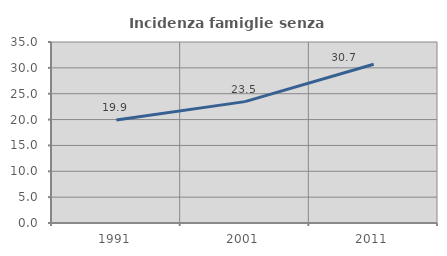
| Category | Incidenza famiglie senza nuclei |
|---|---|
| 1991.0 | 19.931 |
| 2001.0 | 23.471 |
| 2011.0 | 30.696 |